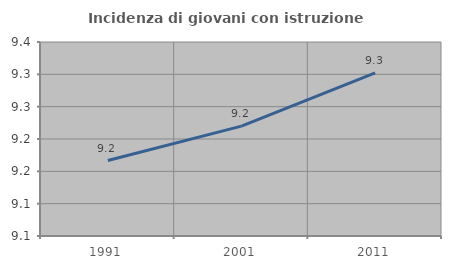
| Category | Incidenza di giovani con istruzione universitaria |
|---|---|
| 1991.0 | 9.167 |
| 2001.0 | 9.22 |
| 2011.0 | 9.302 |